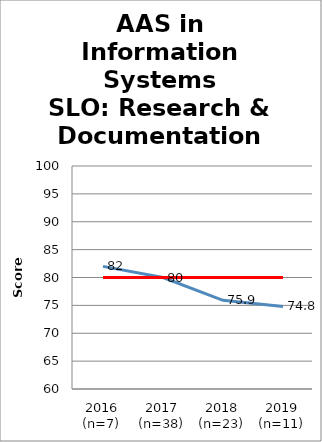
| Category | Series 0 | Series 1 |
|---|---|---|
| 2016 (n=7) | 82 | 80 |
| 2017 (n=38) | 80 | 80 |
| 2018 (n=23) | 75.9 | 80 |
| 2019 (n=11) | 74.8 | 80 |